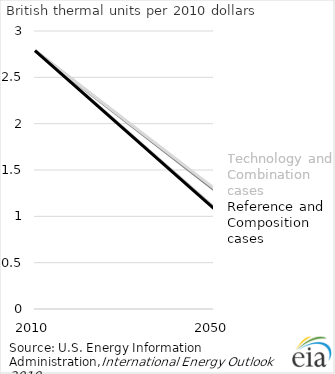
| Category | Macro_man | Combo_man | Tech_man | Ref_man |
|---|---|---|---|---|
| 2010.0 | 2.787 | 2.787 | 2.787 | 2.787 |
| 2050.0 | 1.096 | 1.288 | 1.305 | 1.082 |